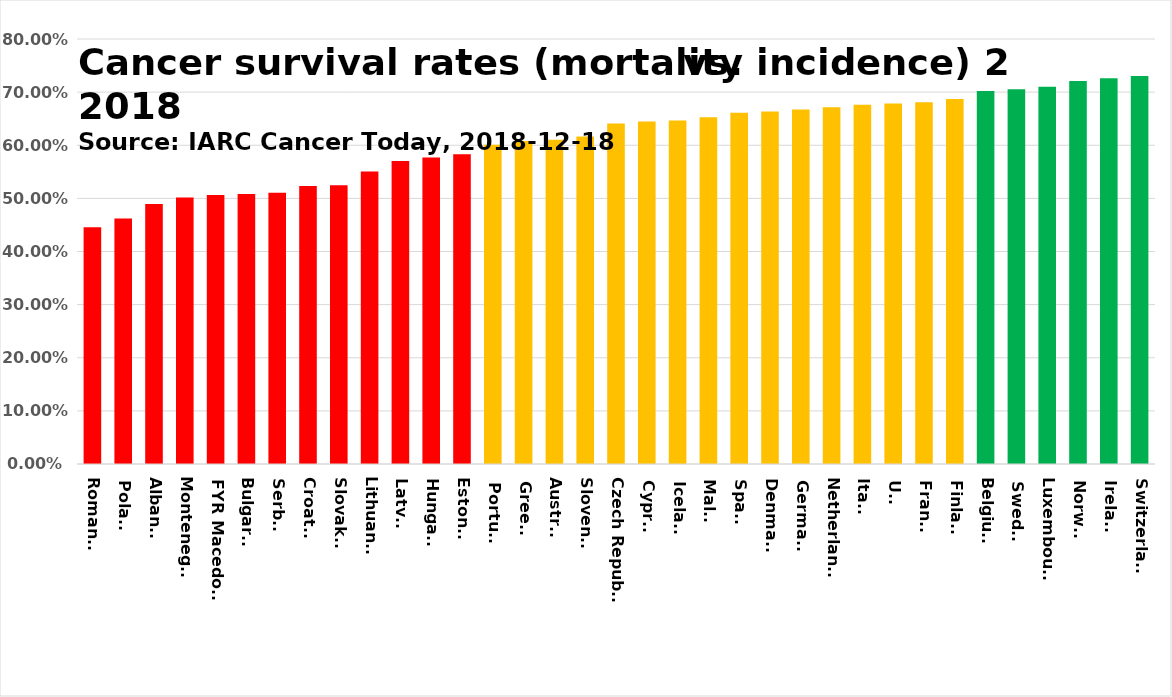
| Category | Series 0 |
|---|---|
| Romania | 0.446 |
| Poland | 0.462 |
| Albania | 0.489 |
| Montenegro | 0.502 |
| FYR Macedonia | 0.506 |
| Bulgaria | 0.508 |
| Serbia | 0.51 |
| Croatia | 0.523 |
| Slovakia | 0.525 |
| Lithuania | 0.55 |
| Latvia | 0.57 |
| Hungary | 0.577 |
| Estonia | 0.583 |
| Portugal | 0.601 |
| Greece | 0.608 |
| Austria | 0.61 |
| Slovenia | 0.617 |
| Czech Republic | 0.641 |
| Cyprus | 0.645 |
| Iceland | 0.647 |
| Malta | 0.653 |
| Spain | 0.661 |
| Denmark | 0.664 |
| Germany | 0.667 |
| Netherlands | 0.672 |
| Italy | 0.676 |
| UK  | 0.679 |
| France | 0.681 |
| Finland | 0.687 |
| Belgium | 0.702 |
| Sweden | 0.705 |
| Luxembourg | 0.71 |
| Norway | 0.721 |
| Ireland | 0.726 |
| Switzerland | 0.73 |